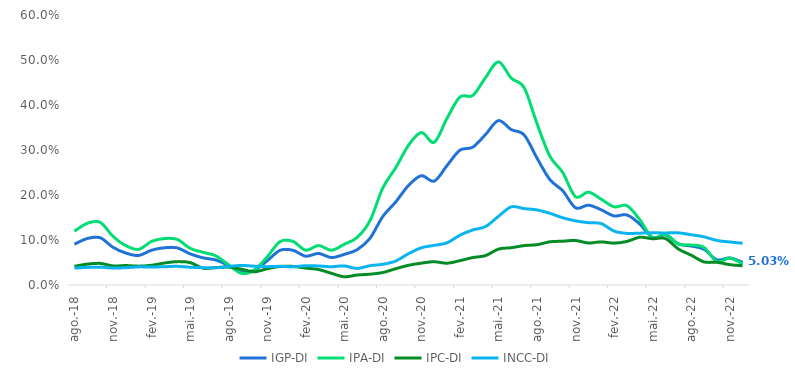
| Category | IGP-DI | IPA-DI | IPC-DI | INCC-DI |
|---|---|---|---|---|
| 2018-08-01 | 0.091 | 0.12 | 0.042 | 0.038 |
| 2018-09-01 | 0.103 | 0.137 | 0.046 | 0.039 |
| 2018-10-01 | 0.105 | 0.139 | 0.048 | 0.04 |
| 2018-11-01 | 0.084 | 0.108 | 0.042 | 0.038 |
| 2018-12-01 | 0.071 | 0.088 | 0.043 | 0.038 |
| 2019-01-01 | 0.066 | 0.079 | 0.042 | 0.04 |
| 2019-02-01 | 0.077 | 0.097 | 0.044 | 0.04 |
| 2019-03-01 | 0.083 | 0.103 | 0.049 | 0.041 |
| 2019-04-01 | 0.082 | 0.101 | 0.052 | 0.042 |
| 2019-05-01 | 0.069 | 0.082 | 0.05 | 0.04 |
| 2019-06-01 | 0.06 | 0.073 | 0.037 | 0.039 |
| 2019-07-01 | 0.056 | 0.065 | 0.039 | 0.038 |
| 2019-08-01 | 0.043 | 0.045 | 0.04 | 0.041 |
| 2019-09-01 | 0.03 | 0.026 | 0.035 | 0.044 |
| 2019-10-01 | 0.033 | 0.033 | 0.029 | 0.042 |
| 2019-11-01 | 0.054 | 0.062 | 0.036 | 0.041 |
| 2019-12-01 | 0.077 | 0.096 | 0.041 | 0.042 |
| 2020-01-01 | 0.077 | 0.097 | 0.041 | 0.04 |
| 2020-02-01 | 0.064 | 0.077 | 0.038 | 0.043 |
| 2020-03-01 | 0.07 | 0.088 | 0.034 | 0.042 |
| 2020-04-01 | 0.061 | 0.077 | 0.026 | 0.041 |
| 2020-05-01 | 0.068 | 0.09 | 0.018 | 0.042 |
| 2020-06-01 | 0.078 | 0.106 | 0.022 | 0.037 |
| 2020-07-01 | 0.104 | 0.143 | 0.024 | 0.043 |
| 2020-08-01 | 0.152 | 0.216 | 0.028 | 0.046 |
| 2020-09-01 | 0.184 | 0.26 | 0.036 | 0.053 |
| 2020-10-01 | 0.221 | 0.31 | 0.044 | 0.07 |
| 2020-11-01 | 0.243 | 0.339 | 0.049 | 0.083 |
| 2020-12-01 | 0.231 | 0.317 | 0.052 | 0.088 |
| 2021-01-01 | 0.266 | 0.371 | 0.048 | 0.094 |
| 2021-02-01 | 0.3 | 0.418 | 0.054 | 0.111 |
| 2021-03-01 | 0.306 | 0.421 | 0.061 | 0.122 |
| 2021-04-01 | 0.335 | 0.461 | 0.065 | 0.13 |
| 2021-05-01 | 0.365 | 0.496 | 0.08 | 0.153 |
| 2021-06-01 | 0.345 | 0.46 | 0.083 | 0.174 |
| 2021-07-01 | 0.334 | 0.438 | 0.088 | 0.17 |
| 2021-08-01 | 0.282 | 0.359 | 0.09 | 0.167 |
| 2021-09-01 | 0.234 | 0.286 | 0.096 | 0.159 |
| 2021-10-01 | 0.21 | 0.25 | 0.097 | 0.149 |
| 2021-11-01 | 0.172 | 0.196 | 0.099 | 0.142 |
| 2021-12-01 | 0.177 | 0.206 | 0.093 | 0.138 |
| 2022-01-01 | 0.167 | 0.191 | 0.096 | 0.136 |
| 2022-02-01 | 0.154 | 0.174 | 0.093 | 0.12 |
| 2022-03-01 | 0.156 | 0.176 | 0.097 | 0.115 |
| 2022-04-01 | 0.135 | 0.145 | 0.106 | 0.115 |
| 2022-05-01 | 0.106 | 0.105 | 0.103 | 0.116 |
| 2022-06-01 | 0.111 | 0.113 | 0.103 | 0.116 |
| 2022-07-01 | 0.091 | 0.091 | 0.08 | 0.116 |
| 2022-08-01 | 0.087 | 0.089 | 0.066 | 0.112 |
| 2022-09-01 | 0.079 | 0.083 | 0.051 | 0.107 |
| 2022-10-01 | 0.056 | 0.052 | 0.05 | 0.099 |
| 2022-11-01 | 0.06 | 0.06 | 0.045 | 0.096 |
| 2022-12-01 | 0.05 | 0.047 | 0.043 | 0.093 |